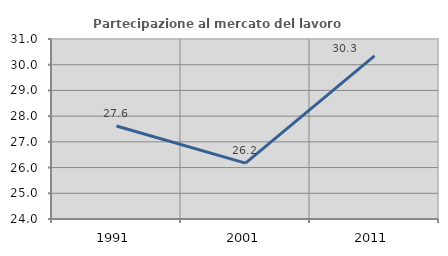
| Category | Partecipazione al mercato del lavoro  femminile |
|---|---|
| 1991.0 | 27.619 |
| 2001.0 | 26.172 |
| 2011.0 | 30.345 |